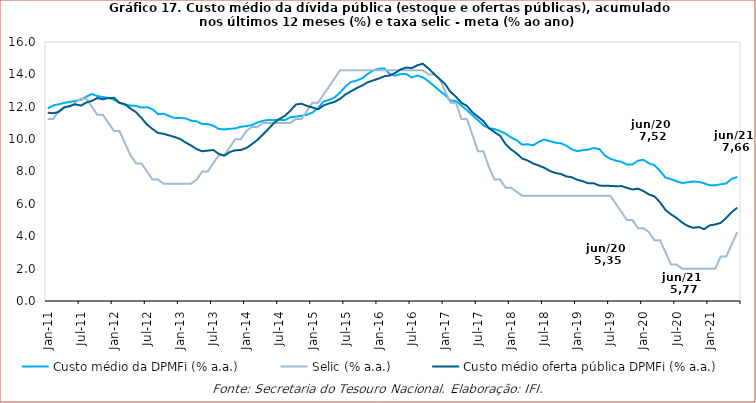
| Category | Custo médio da DPMFi (% a.a.) | Selic (% a.a.) | Custo médio oferta pública DPMFi (% a.a.) |
|---|---|---|---|
| 2011-01-31 | 11.9 | 11.25 | 11.63 |
| 2011-02-28 | 12.08 | 11.25 | 11.6 |
| 2011-03-31 | 12.155 | 11.75 | 11.68 |
| 2011-04-30 | 12.24 | 12 | 11.96 |
| 2011-05-31 | 12.3 | 12 | 12.05 |
| 2011-06-30 | 12.36 | 12.25 | 12.15 |
| 2011-07-31 | 12.43 | 12.5 | 12.07 |
| 2011-08-31 | 12.62 | 12.5 | 12.26 |
| 2011-09-30 | 12.79 | 12 | 12.37 |
| 2011-10-31 | 12.66 | 11.5 | 12.54 |
| 2011-11-30 | 12.6 | 11.5 | 12.46 |
| 2011-12-31 | 12.54 | 11 | 12.54 |
| 2012-01-31 | 12.44 | 10.5 | 12.55 |
| 2012-02-29 | 12.23 | 10.5 | 12.25 |
| 2012-03-31 | 12.12 | 9.75 | 12.16 |
| 2012-04-30 | 12.07 | 9 | 11.89 |
| 2012-05-31 | 12.05 | 8.5 | 11.66 |
| 2012-06-30 | 11.95 | 8.5 | 11.3 |
| 2012-07-31 | 11.97 | 8 | 10.9 |
| 2012-08-31 | 11.85 | 7.5 | 10.62 |
| 2012-09-30 | 11.54 | 7.5 | 10.38 |
| 2012-10-31 | 11.57 | 7.25 | 10.33 |
| 2012-11-30 | 11.43 | 7.25 | 10.23 |
| 2012-12-31 | 11.3 | 7.25 | 10.13 |
| 2013-01-31 | 11.31 | 7.25 | 10.01 |
| 2013-02-28 | 11.28 | 7.25 | 9.79 |
| 2013-03-31 | 11.14 | 7.25 | 9.6 |
| 2013-04-30 | 11.1 | 7.5 | 9.38 |
| 2013-05-31 | 10.93 | 8 | 9.25 |
| 2013-06-30 | 10.93 | 8 | 9.29 |
| 2013-07-31 | 10.83 | 8.5 | 9.33 |
| 2013-08-31 | 10.63 | 9 | 9.09 |
| 2013-09-30 | 10.6 | 9 | 8.98 |
| 2013-10-31 | 10.637 | 9.5 | 9.2 |
| 2013-11-30 | 10.663 | 10 | 9.31 |
| 2013-12-31 | 10.763 | 10 | 9.33 |
| 2014-01-31 | 10.805 | 10.5 | 9.449 |
| 2014-02-28 | 10.867 | 10.75 | 9.686 |
| 2014-03-31 | 11.027 | 10.75 | 9.946 |
| 2014-04-30 | 11.131 | 11 | 10.282 |
| 2014-05-31 | 11.182 | 11 | 10.629 |
| 2014-06-30 | 11.173 | 11 | 10.991 |
| 2014-07-31 | 11.197 | 11 | 11.246 |
| 2014-08-31 | 11.175 | 11 | 11.439 |
| 2014-09-30 | 11.356 | 11 | 11.764 |
| 2014-10-31 | 11.391 | 11.25 | 12.14 |
| 2014-11-30 | 11.435 | 11.25 | 12.187 |
| 2014-12-31 | 11.512 | 11.75 | 12.053 |
| 2015-01-31 | 11.643 | 12.25 | 11.956 |
| 2015-02-27 | 11.909 | 12.25 | 11.84 |
| 2015-03-31 | 12.323 | 12.75 | 12.08 |
| 2015-04-30 | 12.419 | 13.25 | 12.204 |
| 2015-05-31 | 12.579 | 13.75 | 12.297 |
| 2015-06-30 | 12.877 | 14.25 | 12.491 |
| 2015-07-31 | 13.263 | 14.25 | 12.765 |
| 2015-08-31 | 13.532 | 14.25 | 12.96 |
| 2015-09-30 | 13.618 | 14.25 | 13.15 |
| 2015-10-31 | 13.754 | 14.25 | 13.31 |
| 2015-11-30 | 14.029 | 14.25 | 13.51 |
| 2015-12-31 | 14.241 | 14.25 | 13.63 |
| 2016-01-31 | 14.346 | 14.25 | 13.74 |
| 2016-02-29 | 14.372 | 14.25 | 13.88 |
| 2016-03-31 | 14.015 | 14.25 | 13.93 |
| 2016-04-30 | 13.92 | 14.25 | 14.09 |
| 2016-05-31 | 14.016 | 14.25 | 14.31 |
| 2016-06-30 | 14.017 | 14.25 | 14.42 |
| 2016-07-31 | 13.814 | 14.25 | 14.39 |
| 2016-08-31 | 13.924 | 14.25 | 14.56 |
| 2016-09-30 | 13.82 | 14.25 | 14.66 |
| 2016-10-31 | 13.578 | 14 | 14.37 |
| 2016-11-30 | 13.296 | 14 | 14.04 |
| 2016-12-31 | 12.996 | 13.75 | 13.72 |
| 2017-01-31 | 12.739 | 13 | 13.42 |
| 2017-02-28 | 12.394 | 12.25 | 12.92 |
| 2017-03-31 | 12.351 | 12.25 | 12.62 |
| 2017-04-30 | 12.068 | 11.25 | 12.24 |
| 2017-05-31 | 11.784 | 11.25 | 12.05 |
| 2017-06-30 | 11.466 | 10.25 | 11.65 |
| 2017-07-31 | 11.168 | 9.25 | 11.38 |
| 2017-08-31 | 10.85 | 9.25 | 11.1 |
| 2017-09-30 | 10.68 | 8.25 | 10.67 |
| 2017-10-31 | 10.617 | 7.5 | 10.43 |
| 2017-11-30 | 10.498 | 7.5 | 10.21 |
| 2017-12-31 | 10.339 | 7 | 9.69 |
| 2018-01-31 | 10.104 | 7 | 9.36 |
| 2018-02-28 | 9.934 | 6.75 | 9.12 |
| 2018-03-31 | 9.659 | 6.5 | 8.8 |
| 2018-04-30 | 9.686 | 6.5 | 8.68 |
| 2018-05-31 | 9.617 | 6.5 | 8.49 |
| 2018-06-30 | 9.83 | 6.5 | 8.37 |
| 2018-07-31 | 9.971 | 6.5 | 8.23 |
| 2018-08-31 | 9.878 | 6.5 | 8.04 |
| 2018-09-30 | 9.78 | 6.5 | 7.91 |
| 2018-10-31 | 9.743 | 6.5 | 7.85 |
| 2018-11-30 | 9.6 | 6.5 | 7.7 |
| 2018-12-31 | 9.371 | 6.5 | 7.64 |
| 2019-01-31 | 9.254 | 6.5 | 7.49 |
| 2019-02-28 | 9.318 | 6.5 | 7.4 |
| 2019-03-31 | 9.355 | 6.5 | 7.27 |
| 2019-04-30 | 9.449 | 6.5 | 7.27 |
| 2019-05-31 | 9.385 | 6.5 | 7.13 |
| 2019-06-30 | 8.987 | 6.5 | 7.12 |
| 2019-07-31 | 8.788 | 6.5 | 7.11 |
| 2019-08-31 | 8.669 | 6 | 7.09 |
| 2019-09-30 | 8.594 | 5.5 | 7.1 |
| 2019-10-31 | 8.431 | 5 | 6.99 |
| 2019-11-30 | 8.435 | 5 | 6.89 |
| 2019-12-31 | 8.665 | 4.5 | 6.94 |
| 2020-01-31 | 8.723 | 4.5 | 6.79 |
| 2020-02-29 | 8.505 | 4.25 | 6.58 |
| 2020-03-31 | 8.392 | 3.75 | 6.46 |
| 2020-04-30 | 8.031 | 3.75 | 6.1 |
| 2020-05-31 | 7.621 | 3 | 5.62 |
| 2020-06-30 | 7.524 | 2.25 | 5.35 |
| 2020-07-31 | 7.398 | 2.25 | 5.13 |
| 2020-08-31 | 7.286 | 2 | 4.85 |
| 2020-09-30 | 7.331 | 2 | 4.64 |
| 2020-10-31 | 7.381 | 2 | 4.52 |
| 2020-11-30 | 7.365 | 2 | 4.57 |
| 2020-12-31 | 7.269 | 2 | 4.44 |
| 2021-01-31 | 7.146 | 2 | 4.67 |
| 2021-02-28 | 7.146 | 2 | 4.73 |
| 2021-03-31 | 7.21 | 2.75 | 4.827 |
| 2021-04-30 | 7.263 | 2.75 | 5.134 |
| 2021-05-31 | 7.552 | 3.5 | 5.488 |
| 2021-06-30 | 7.662 | 4.25 | 5.765 |